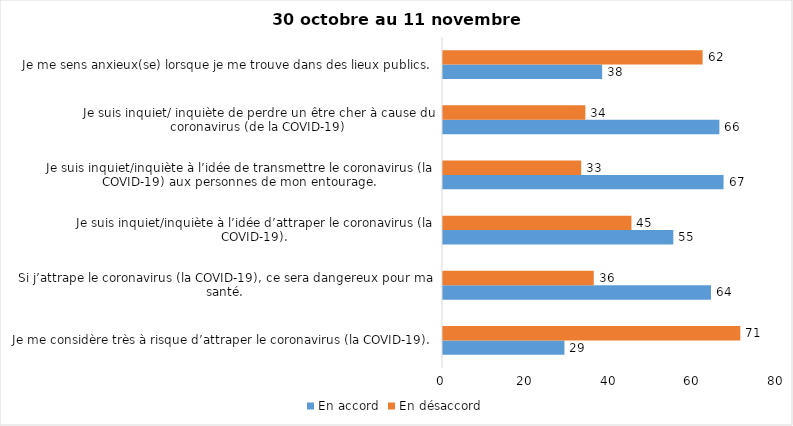
| Category | En accord | En désaccord |
|---|---|---|
| Je me considère très à risque d’attraper le coronavirus (la COVID-19). | 29 | 71 |
| Si j’attrape le coronavirus (la COVID-19), ce sera dangereux pour ma santé. | 64 | 36 |
| Je suis inquiet/inquiète à l’idée d’attraper le coronavirus (la COVID-19). | 55 | 45 |
| Je suis inquiet/inquiète à l’idée de transmettre le coronavirus (la COVID-19) aux personnes de mon entourage. | 67 | 33 |
| Je suis inquiet/ inquiète de perdre un être cher à cause du coronavirus (de la COVID-19) | 66 | 34 |
| Je me sens anxieux(se) lorsque je me trouve dans des lieux publics. | 38 | 62 |